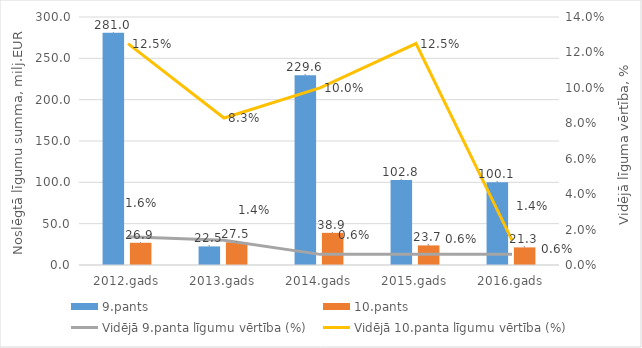
| Category | 9.pants | 10.pants |
|---|---|---|
| 2012.gads | 281 | 26.9 |
| 2013.gads | 22.5 | 27.5 |
| 2014.gads | 229.6 | 38.9 |
| 2015.gads | 102.8 | 23.7 |
| 2016.gads | 100.1 | 21.3 |